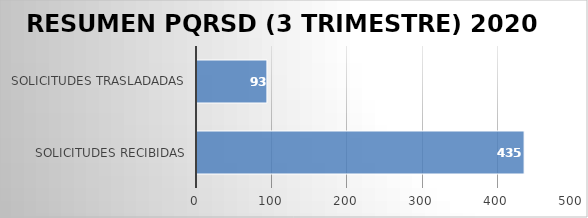
| Category | Descripción |
|---|---|
| SOLICITUDES RECIBIDAS | 435 |
| SOLICITUDES TRASLADADAS | 93 |